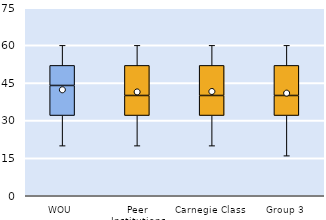
| Category | 25th | 50th | 75th |
|---|---|---|---|
| WOU | 32 | 12 | 8 |
| Peer Institutions | 32 | 8 | 12 |
| Carnegie Class | 32 | 8 | 12 |
| Group 3 | 32 | 8 | 12 |